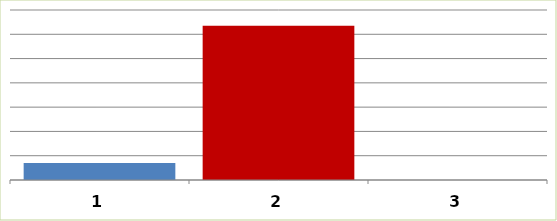
| Category | Series 0 |
|---|---|
| 0 | 7036410 |
| 1 | 63469267 |
| 2 | 0 |